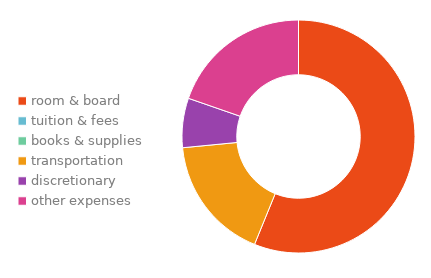
| Category | Series 0 |
|---|---|
| room & board | 0.253 |
| tuition & fees | 0.336 |
| books & supplies | 0.146 |
| transportation | 0.078 |
| discretionary | 0.076 |
| other expenses | 0.112 |